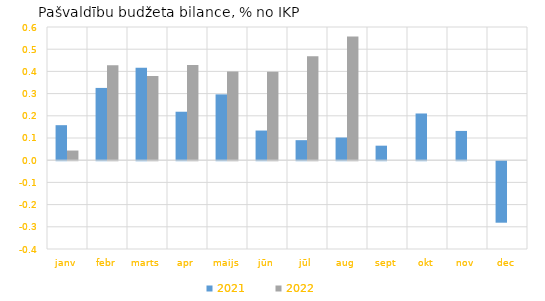
| Category | 2021 | 2022 |
|---|---|---|
| janv | 0.158 | 0.044 |
| febr | 0.326 | 0.428 |
| marts | 0.416 | 0.379 |
| apr | 0.218 | 0.429 |
| maijs | 0.297 | 0.4 |
| jūn | 0.134 | 0.398 |
| jūl | 0.09 | 0.469 |
| aug | 0.102 | 0.557 |
| sept | 0.065 | 0 |
| okt | 0.21 | 0 |
| nov | 0.132 | 0 |
| dec | -0.277 | 0 |